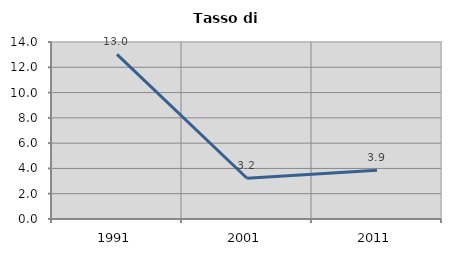
| Category | Tasso di disoccupazione   |
|---|---|
| 1991.0 | 13.025 |
| 2001.0 | 3.226 |
| 2011.0 | 3.861 |